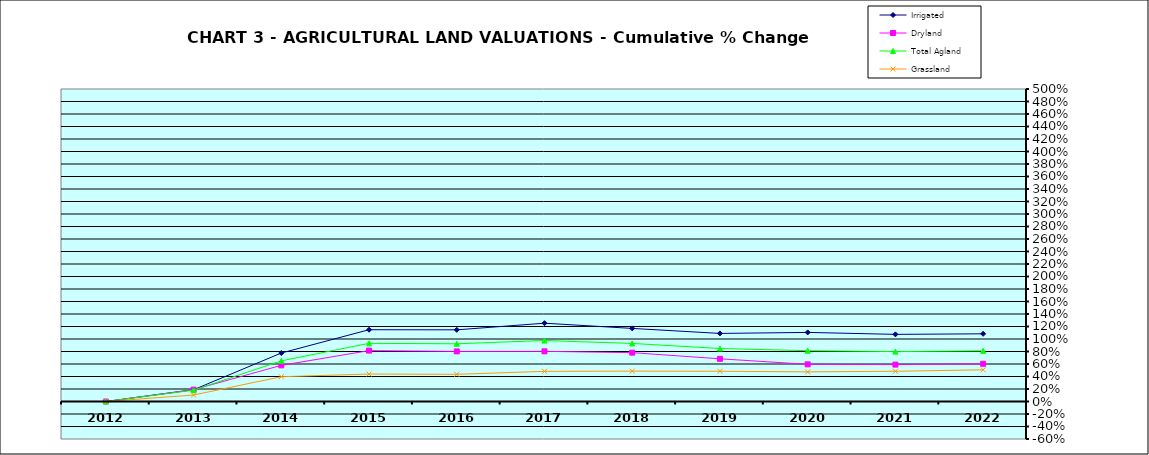
| Category | Irrigated | Dryland | Total Agland | Grassland |
|---|---|---|---|---|
| 2012.0 | 0 | 0 | 0 | 0 |
| 2013.0 | 0.188 | 0.19 | 0.181 | 0.104 |
| 2014.0 | 0.776 | 0.578 | 0.65 | 0.396 |
| 2015.0 | 1.148 | 0.814 | 0.93 | 0.439 |
| 2016.0 | 1.147 | 0.802 | 0.923 | 0.435 |
| 2017.0 | 1.253 | 0.803 | 0.976 | 0.482 |
| 2018.0 | 1.169 | 0.781 | 0.929 | 0.486 |
| 2019.0 | 1.089 | 0.683 | 0.848 | 0.484 |
| 2020.0 | 1.105 | 0.595 | 0.813 | 0.474 |
| 2021.0 | 1.074 | 0.59 | 0.798 | 0.484 |
| 2022.0 | 1.083 | 0.604 | 0.811 | 0.507 |